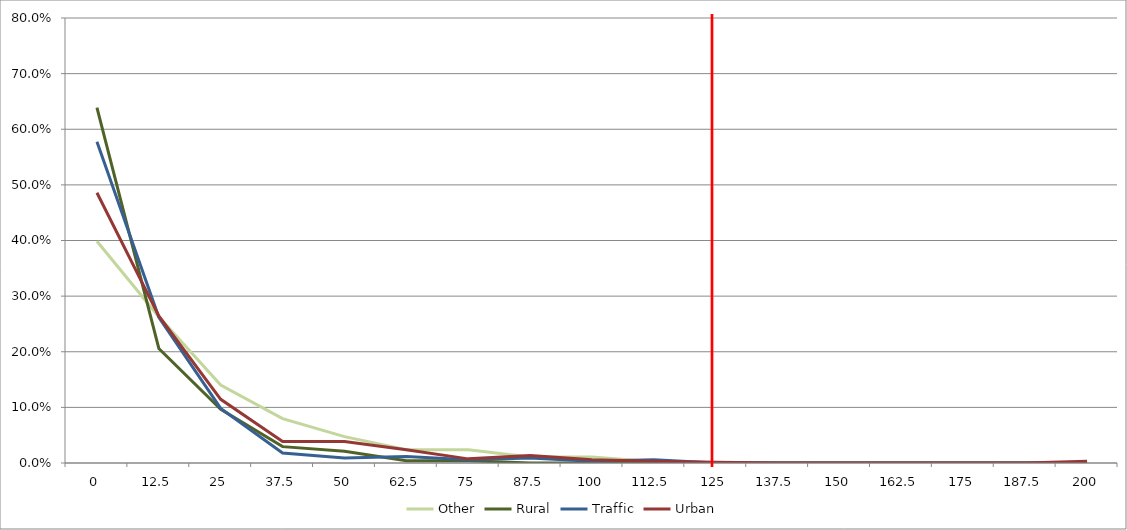
| Category | Other | Rural | Traffic | Urban |
|---|---|---|---|---|
| 0.0 | 0.399 | 0.639 | 0.577 | 0.486 |
| 12.5 | 0.263 | 0.206 | 0.262 | 0.264 |
| 25.0 | 0.14 | 0.097 | 0.098 | 0.114 |
| 37.5 | 0.08 | 0.029 | 0.018 | 0.039 |
| 50.0 | 0.047 | 0.021 | 0.009 | 0.039 |
| 62.5 | 0.024 | 0.004 | 0.012 | 0.024 |
| 75.0 | 0.024 | 0.004 | 0.006 | 0.007 |
| 87.5 | 0.011 | 0 | 0.009 | 0.013 |
| 100.0 | 0.011 | 0 | 0.003 | 0.006 |
| 112.5 | 0.002 | 0 | 0.006 | 0.003 |
| 125.0 | 0 | 0 | 0 | 0.001 |
| 137.5 | 0 | 0 | 0 | 0 |
| 150.0 | 0 | 0 | 0 | 0 |
| 162.5 | 0 | 0 | 0 | 0 |
| 175.0 | 0 | 0 | 0 | 0 |
| 187.5 | 0 | 0 | 0 | 0 |
| 200.0 | 0 | 0 | 0 | 0.003 |